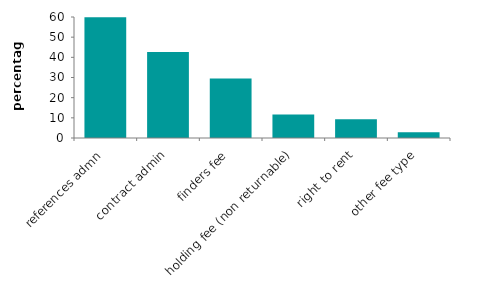
| Category | Series 0 |
|---|---|
| references admn | 59.914 |
| contract admin | 42.689 |
| finders fee | 29.452 |
| holding fee (non returnable) | 11.631 |
| right to rent | 9.294 |
| other fee type | 2.853 |